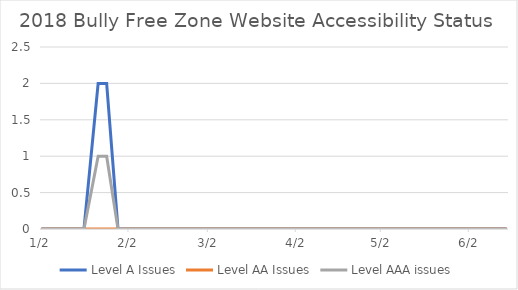
| Category | Level A Issues | Level AA Issues | Level AAA issues |
|---|---|---|---|
| 2018-01-02 22:25:03 | 0 | 0 | 0 |
| 2018-01-07 22:13:51 | 0 | 0 | 0 |
| 2018-01-12 22:12:05 | 0 | 0 | 0 |
| 2018-01-17 22:00:46 | 0 | 0 | 0 |
| 2018-01-22 22:23:12 | 2 | 0 | 1 |
| 2018-01-25 07:41:26 | 2 | 0 | 1 |
| 2018-01-29 22:30:45 | 0 | 0 | 0 |
| 2018-02-03 22:42:26 | 0 | 0 | 0 |
| 2018-02-08 22:24:36 | 0 | 0 | 0 |
| 2018-02-13 21:32:17 | 0 | 0 | 0 |
| 2018-02-18 22:18:57 | 0 | 0 | 0 |
| 2018-02-23 21:52:39 | 0 | 0 | 0 |
| 2018-02-28 22:53:25 | 0 | 0 | 0 |
| 2018-03-05 21:18:25 | 0 | 0 | 0 |
| 2018-03-10 21:34:44 | 0 | 0 | 0 |
| 2018-03-15 21:36:21 | 0 | 0 | 0 |
| 2018-03-20 21:32:01 | 0 | 0 | 0 |
| 2018-03-25 21:42:56 | 0 | 0 | 0 |
| 2018-03-30 21:32:01 | 0 | 0 | 0 |
| 2018-04-04 21:37:45 | 0 | 0 | 0 |
| 2018-04-09 22:08:20 | 0 | 0 | 0 |
| 2018-04-14 21:58:34 | 0 | 0 | 0 |
| 2018-04-19 22:27:11 | 0 | 0 | 0 |
| 2018-04-24 22:44:19 | 0 | 0 | 0 |
| 2018-04-29 21:34:41 | 0 | 0 | 0 |
| 2018-05-04 21:35:41 | 0 | 0 | 0 |
| 2018-05-09 21:40:05 | 0 | 0 | 0 |
| 2018-05-14 22:47:45 | 0 | 0 | 0 |
| 2018-05-19 21:37:26 | 0 | 0 | 0 |
| 2018-05-24 21:20:51 | 0 | 0 | 0 |
| 2018-05-29 21:37:18 | 0 | 0 | 0 |
| 2018-06-03 21:53:55 | 0 | 0 | 0 |
| 2018-06-08 21:56:53 | 0 | 0 | 0 |
| 2018-06-13 21:31:24 | 0 | 0 | 0 |
| 2018-06-15 22:07:39 | 0 | 0 | 0 |